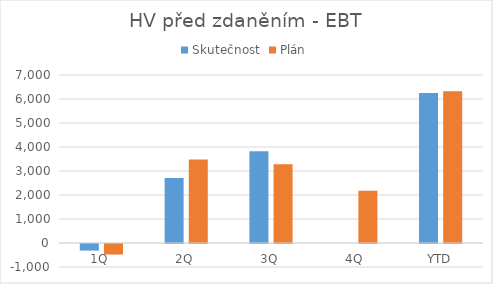
| Category | Skutečnost | Plán |
|---|---|---|
| 1Q | -274 | -440 |
| 2Q | 2704 | 3480 |
| 3Q | 3821 | 3280 |
| 4Q | 0 | 2180 |
| YTD | 6251 | 6320 |